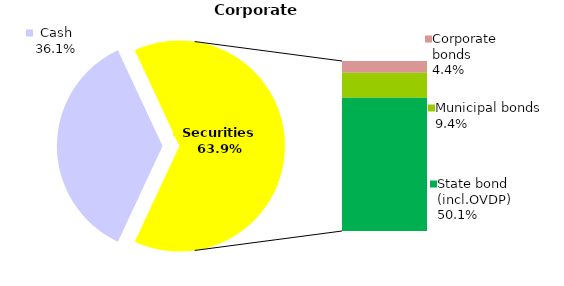
| Category | Corporate |
|---|---|
| Cash | 116.185 |
| Bank metals | 0 |
| Real estate | 0 |
| Other assets | 0 |
| Equities | 0.022 |
| Corporate bonds | 14.304 |
| Municipal bonds | 30.139 |
| State bond (incl.OVDP) | 161.295 |